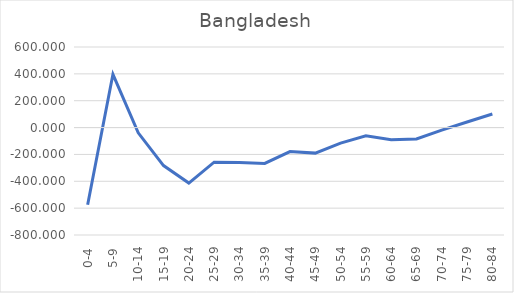
| Category | Series 0 |
|---|---|
| 0-4 | -574.539 |
| 5-9 | 396.511 |
| 10-14 | -38.888 |
| 15-19 | -283.128 |
| 20-24 | -413.399 |
| 25-29 | -257.931 |
| 30-34 | -260.48 |
| 35-39 | -266.833 |
| 40-44 | -178.562 |
| 45-49 | -190.247 |
| 50-54 | -115.389 |
| 55-59 | -61.036 |
| 60-64 | -91.255 |
| 65-69 | -85.198 |
| 70-74 | -19.38 |
| 75-79 | 41.328 |
| 80-84 | 100.944 |